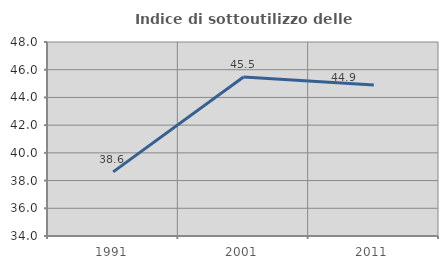
| Category | Indice di sottoutilizzo delle abitazioni  |
|---|---|
| 1991.0 | 38.63 |
| 2001.0 | 45.479 |
| 2011.0 | 44.898 |